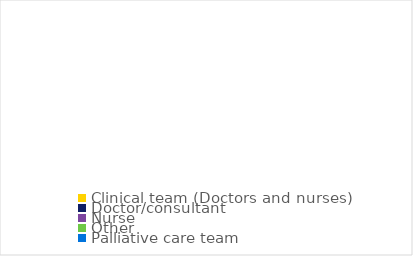
| Category | Series 0 |
|---|---|
| Clinical team (Doctors and nurses) | 0 |
| Doctor/consultant | 0 |
| Nurse | 0 |
| Other | 0 |
| Palliative care team | 0 |